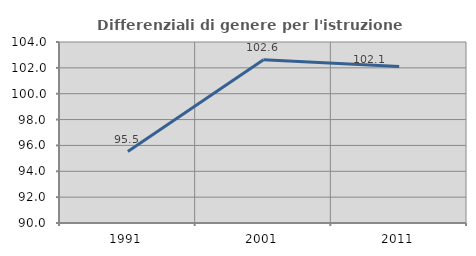
| Category | Differenziali di genere per l'istruzione superiore |
|---|---|
| 1991.0 | 95.527 |
| 2001.0 | 102.621 |
| 2011.0 | 102.11 |